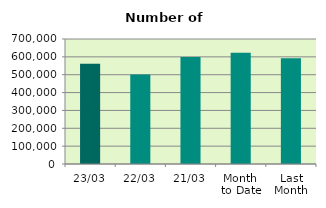
| Category | Series 0 |
|---|---|
| 23/03 | 560954 |
| 22/03 | 501238 |
| 21/03 | 599824 |
| Month 
to Date | 623581.647 |
| Last
Month | 592303 |